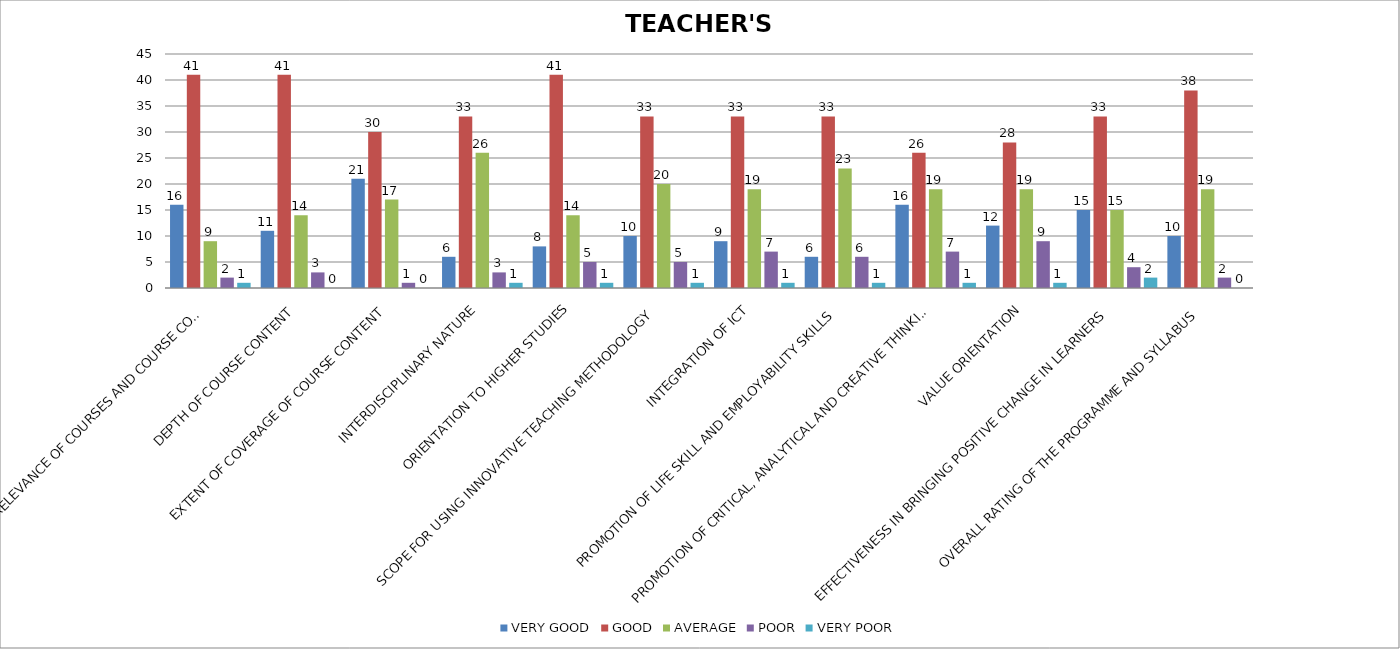
| Category | VERY GOOD | GOOD | AVERAGE | POOR | VERY POOR |
|---|---|---|---|---|---|
| CONTEMPORARY RELEVANCE OF COURSES AND COURSE CONTENT | 16 | 41 | 9 | 2 | 1 |
| DEPTH OF COURSE CONTENT | 11 | 41 | 14 | 3 | 0 |
| EXTENT OF COVERAGE OF COURSE CONTENT | 21 | 30 | 17 | 1 | 0 |
| INTERDISCIPLINARY NATURE | 6 | 33 | 26 | 3 | 1 |
| ORIENTATION TO HIGHER STUDIES | 8 | 41 | 14 | 5 | 1 |
| SCOPE FOR USING INNOVATIVE TEACHING METHODOLOGY | 10 | 33 | 20 | 5 | 1 |
| INTEGRATION OF ICT | 9 | 33 | 19 | 7 | 1 |
| PROMOTION OF LIFE SKILL AND EMPLOYABILITY SKILLS | 6 | 33 | 23 | 6 | 1 |
| PROMOTION OF CRITICAL, ANALYTICAL AND CREATIVE THINKING SKILLS | 16 | 26 | 19 | 7 | 1 |
| VALUE ORIENTATION | 12 | 28 | 19 | 9 | 1 |
| EFFECTIVENESS IN BRINGING POSITIVE CHANGE IN LEARNERS | 15 | 33 | 15 | 4 | 2 |
| OVERALL RATING OF THE PROGRAMME AND SYLLABUS | 10 | 38 | 19 | 2 | 0 |